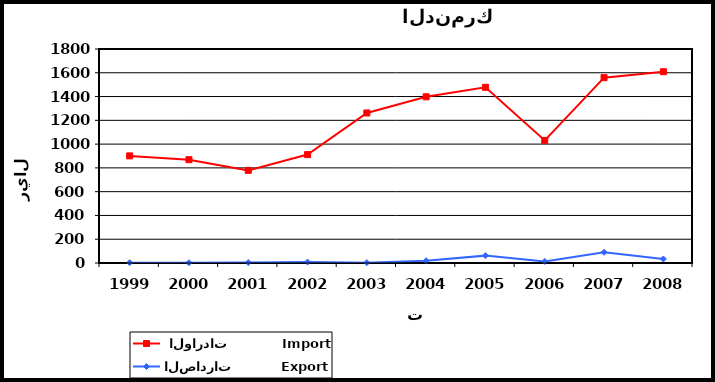
| Category |  الواردات           Import | الصادرات          Export |
|---|---|---|
| 1999.0 | 901 | 3 |
| 2000.0 | 869 | 2 |
| 2001.0 | 779 | 4 |
| 2002.0 | 912 | 8 |
| 2003.0 | 1262 | 3 |
| 2004.0 | 1398 | 19 |
| 2005.0 | 1478 | 62 |
| 2006.0 | 1031 | 13 |
| 2007.0 | 1559 | 90 |
| 2008.0 | 1609 | 34 |